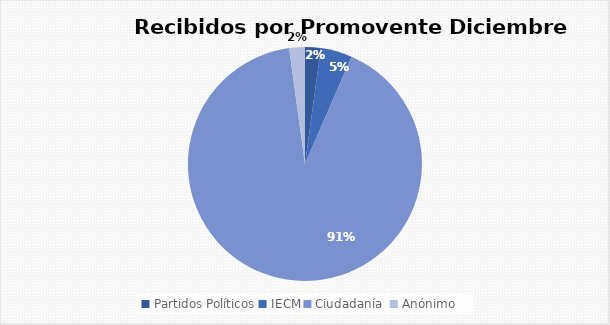
| Category | Recibidos por Promovente DICIEMBRE |
|---|---|
| Partidos Políticos | 1 |
| IECM | 2 |
| Ciudadanía  | 42 |
| Anónimo | 1 |